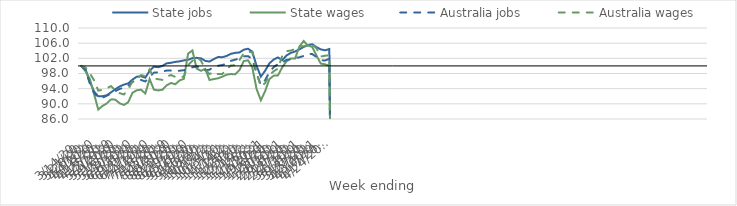
| Category | State jobs | State wages | Australia jobs | Australia wages |
|---|---|---|---|---|
| 14/03/2020 | 100 | 100 | 100 | 100 |
| 21/03/2020 | 99.175 | 98.597 | 98.971 | 99.607 |
| 28/03/2020 | 95.99 | 96.659 | 95.468 | 98.119 |
| 04/04/2020 | 93.279 | 92.679 | 92.921 | 96.261 |
| 11/04/2020 | 91.984 | 88.49 | 91.648 | 93.491 |
| 18/04/2020 | 92.032 | 89.451 | 91.631 | 93.695 |
| 25/04/2020 | 92.255 | 90.104 | 92.161 | 94.112 |
| 02/05/2020 | 93.039 | 91.22 | 92.658 | 94.685 |
| 09/05/2020 | 93.877 | 91.082 | 93.342 | 93.574 |
| 16/05/2020 | 94.583 | 90.137 | 93.935 | 92.809 |
| 23/05/2020 | 95.066 | 89.708 | 94.29 | 92.465 |
| 30/05/2020 | 95.391 | 90.42 | 94.796 | 93.818 |
| 06/06/2020 | 96.405 | 92.916 | 95.779 | 95.924 |
| 13/06/2020 | 97.157 | 93.58 | 96.278 | 96.597 |
| 20/06/2020 | 97.269 | 93.725 | 96.293 | 97.571 |
| 27/06/2020 | 96.901 | 92.737 | 95.898 | 97.324 |
| 04/07/2020 | 98.686 | 96.533 | 97.132 | 99.089 |
| 11/07/2020 | 99.788 | 93.75 | 98.221 | 96.668 |
| 18/07/2020 | 99.66 | 93.54 | 98.324 | 96.5 |
| 25/07/2020 | 100.001 | 93.73 | 98.548 | 96.312 |
| 01/08/2020 | 100.691 | 94.889 | 98.77 | 97.181 |
| 08/08/2020 | 100.821 | 95.502 | 98.766 | 97.601 |
| 15/08/2020 | 101.059 | 95.164 | 98.672 | 97.108 |
| 22/08/2020 | 101.203 | 96.161 | 98.73 | 96.964 |
| 29/08/2020 | 101.454 | 96.595 | 98.866 | 97.198 |
| 05/09/2020 | 101.608 | 103.25 | 99.166 | 100.215 |
| 12/09/2020 | 102.056 | 104.075 | 99.638 | 101.349 |
| 19/09/2020 | 102.129 | 99.303 | 99.835 | 102.253 |
| 26/09/2020 | 102.006 | 98.713 | 99.64 | 101.42 |
| 03/10/2020 | 101.334 | 99.228 | 98.855 | 99.138 |
| 10/10/2020 | 101.147 | 96.299 | 98.997 | 97.834 |
| 17/10/2020 | 101.802 | 96.528 | 99.767 | 98.431 |
| 24/10/2020 | 102.335 | 96.736 | 100.05 | 97.835 |
| 31/10/2020 | 102.305 | 97.171 | 100.228 | 97.89 |
| 07/11/2020 | 102.622 | 97.692 | 100.597 | 99.112 |
| 14/11/2020 | 103.199 | 97.854 | 101.334 | 100.12 |
| 21/11/2020 | 103.44 | 97.796 | 101.652 | 100.166 |
| 28/11/2020 | 103.549 | 98.898 | 101.968 | 101.522 |
| 05/12/2020 | 104.274 | 101.28 | 102.515 | 103.324 |
| 12/12/2020 | 104.53 | 101.48 | 102.583 | 103.755 |
| 19/12/2020 | 103.763 | 99.641 | 101.771 | 103.629 |
| 26/12/2020 | 100.017 | 93.91 | 97.972 | 98.159 |
| 02/01/2021 | 97.172 | 90.937 | 95.021 | 94.58 |
| 09/01/2021 | 98.732 | 93.34 | 96.246 | 95.443 |
| 16/01/2021 | 100.686 | 96.525 | 98.354 | 97.531 |
| 23/01/2021 | 101.68 | 97.43 | 99.666 | 98.597 |
| 30/01/2021 | 102.233 | 97.503 | 100.48 | 99.293 |
| 06/02/2021 | 101.503 | 99.644 | 100.907 | 102.696 |
| 13/02/2021 | 102.75 | 101.22 | 101.592 | 103.915 |
| 20/02/2021 | 103.44 | 101.974 | 101.718 | 104.04 |
| 27/02/2021 | 103.804 | 101.978 | 102.048 | 104.48 |
| 06/03/2021 | 104.371 | 105.068 | 102.273 | 105.217 |
| 13/03/2021 | 104.999 | 106.582 | 102.625 | 105.198 |
| 20/03/2021 | 105.459 | 105.361 | 103.203 | 105.516 |
| 27/03/2021 | 105.724 | 105.03 | 103.136 | 105.634 |
| 03/04/2021 | 104.963 | 102.745 | 102.34 | 104.641 |
| 10/04/2021 | 104.365 | 100.62 | 101.508 | 102.484 |
| 17/04/2021 | 104.111 | 100.413 | 101.424 | 102.692 |
| 24/04/2021 | 104.452 | 100.056 | 101.89 | 102.787 |